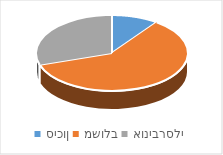
| Category | Series 0 |
|---|---|
| סיכון | 1 |
| משולב | 6 |
| אוניברסלי | 3 |